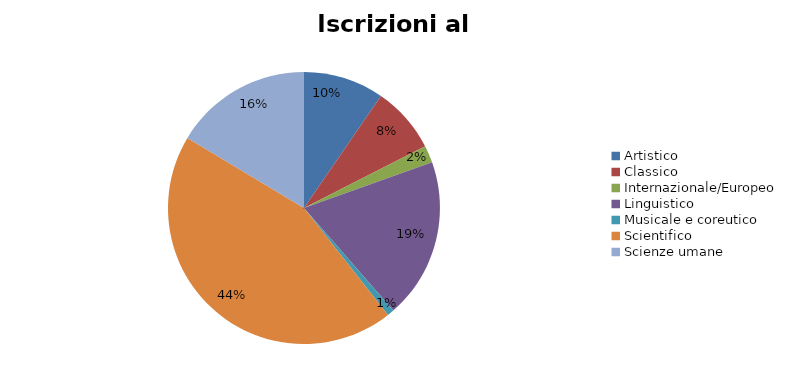
| Category | Series 0 | Series 1 |
|---|---|---|
| Artistico | 1717 |  |
| Classico | 1420 |  |
| Internazionale/Europeo | 367 |  |
| Linguistico | 3417 |  |
| Musicale e coreutico | 144 |  |
| Scientifico | 7926 |  |
| Scienze umane | 2938 |  |